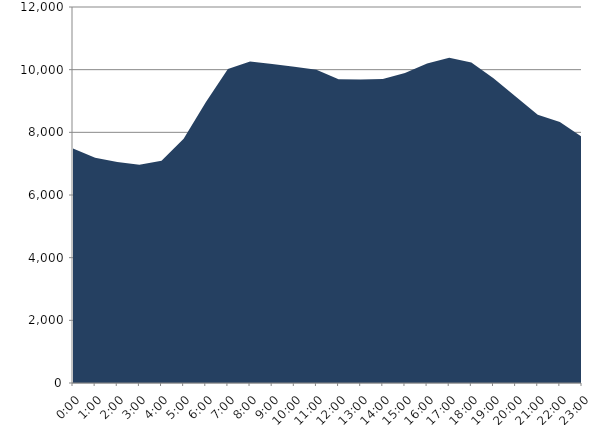
| Category | Series 0 | Series 1 |
|---|---|---|
| 2019-12-18 |  | 7486.83 |
| 2019-12-18 01:00:00 |  | 7186.96 |
| 2019-12-18 02:00:00 |  | 7053.75 |
| 2019-12-18 03:00:00 |  | 6963.73 |
| 2019-12-18 04:00:00 |  | 7089.29 |
| 2019-12-18 05:00:00 |  | 7794.48 |
| 2019-12-18 06:00:00 |  | 8956.15 |
| 2019-12-18 07:00:00 |  | 10022.18 |
| 2019-12-18 08:00:00 |  | 10261.6 |
| 2019-12-18 09:00:00 |  | 10183.63 |
| 2019-12-18 10:00:00 |  | 10096.65 |
| 2019-12-18 11:00:00 |  | 9996.14 |
| 2019-12-18 12:00:00 |  | 9695.57 |
| 2019-12-18 13:00:00 |  | 9688.37 |
| 2019-12-18 14:00:00 |  | 9706.06 |
| 2019-12-18 15:00:00 |  | 9897.54 |
| 2019-12-18 16:00:00 |  | 10193.21 |
| 2019-12-18 17:00:00 |  | 10377.65 |
| 2019-12-18 18:00:00 |  | 10227.05 |
| 2019-12-18 19:00:00 |  | 9723.07 |
| 2019-12-18 20:00:00 |  | 9143.76 |
| 2019-12-18 21:00:00 |  | 8561.48 |
| 2019-12-18 22:00:00 |  | 8328.63 |
| 2019-12-18 23:00:00 |  | 7850.14 |